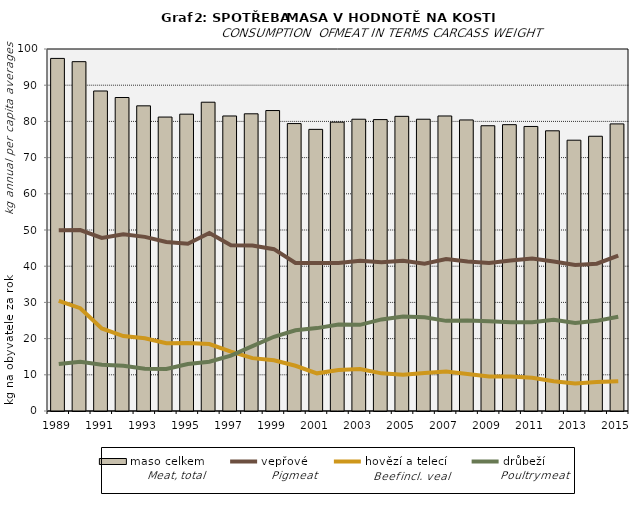
| Category | maso celkem |
|---|---|
| 1989.0 | 97.4 |
| 1990.0 | 96.5 |
| 1991.0 | 88.4 |
| 1992.0 | 86.6 |
| 1993.0 | 84.3 |
| 1994.0 | 81.2 |
| 1995.0 | 82 |
| 1996.0 | 85.3 |
| 1997.0 | 81.5 |
| 1998.0 | 82.1 |
| 1999.0 | 83 |
| 2000.0 | 79.4 |
| 2001.0 | 77.8 |
| 2002.0 | 79.8 |
| 2003.0 | 80.6 |
| 2004.0 | 80.5 |
| 2005.0 | 81.4 |
| 2006.0 | 80.6 |
| 2007.0 | 81.5 |
| 2008.0 | 80.4 |
| 2009.0 | 78.8 |
| 2010.0 | 79.1 |
| 2011.0 | 78.6 |
| 2012.0 | 77.4 |
| 2013.0 | 74.81 |
| 2014.0 | 75.9 |
| 2015.0 | 79.31 |